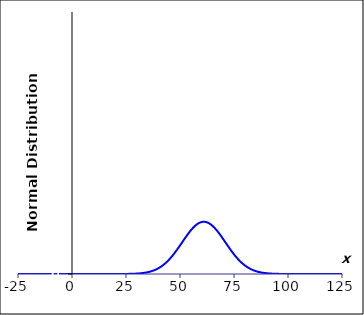
| Category | Series 0 |
|---|---|
| -25.0 | 0 |
| -24.0 | 0 |
| -23.0 | 0 |
| -22.0 | 0 |
| -21.0 | 0 |
| -20.0 | 0 |
| -19.0 | 0 |
| -18.0 | 0 |
| -17.0 | 0 |
| -16.0 | 0 |
| -15.0 | 0 |
| -14.0 | 0 |
| -13.0 | 0 |
| -12.0 | 0 |
| -11.0 | 0 |
| -10.0 | 0 |
| -9.0 | 0 |
| -8.0 | 0 |
| -7.0 | 0 |
| -6.0 | 0 |
| -5.0 | 0 |
| -4.0 | 0 |
| -3.0 | 0 |
| -2.0 | 0 |
| -1.0 | 0 |
| 0.0 | 0 |
| 1.0 | 0 |
| 2.0 | 0 |
| 3.0 | 0 |
| 4.0 | 0 |
| 5.0 | 0 |
| 6.0 | 0 |
| 7.0 | 0 |
| 8.0 | 0 |
| 9.0 | 0 |
| 10.0 | 0 |
| 11.0 | 0 |
| 12.0 | 0 |
| 13.0 | 0 |
| 14.0 | 0 |
| 15.0 | 0 |
| 16.0 | 0 |
| 17.0 | 0 |
| 18.0 | 0 |
| 19.0 | 0 |
| 20.0 | 0 |
| 21.0 | 0 |
| 22.0 | 0 |
| 23.0 | 0 |
| 24.0 | 0 |
| 25.0 | 0 |
| 26.0 | 0 |
| 27.0 | 0 |
| 28.0 | 0 |
| 29.0 | 0 |
| 30.0 | 0 |
| 31.0 | 0 |
| 32.0 | 0.001 |
| 33.0 | 0.001 |
| 34.0 | 0.001 |
| 35.0 | 0.001 |
| 36.0 | 0.002 |
| 37.0 | 0.002 |
| 38.0 | 0.003 |
| 39.0 | 0.004 |
| 40.0 | 0.004 |
| 41.0 | 0.005 |
| 42.0 | 0.007 |
| 43.0 | 0.008 |
| 44.0 | 0.009 |
| 45.0 | 0.011 |
| 46.0 | 0.013 |
| 47.0 | 0.015 |
| 48.0 | 0.017 |
| 49.0 | 0.019 |
| 50.0 | 0.022 |
| 51.0 | 0.024 |
| 52.0 | 0.027 |
| 53.0 | 0.029 |
| 54.0 | 0.031 |
| 55.0 | 0.033 |
| 56.0 | 0.035 |
| 57.0 | 0.037 |
| 58.0 | 0.038 |
| 59.0 | 0.039 |
| 60.0 | 0.04 |
| 61.0 | 0.04 |
| 62.0 | 0.04 |
| 63.0 | 0.039 |
| 64.0 | 0.038 |
| 65.0 | 0.037 |
| 66.0 | 0.035 |
| 67.0 | 0.033 |
| 68.0 | 0.031 |
| 69.0 | 0.029 |
| 70.0 | 0.027 |
| 71.0 | 0.024 |
| 72.0 | 0.022 |
| 73.0 | 0.019 |
| 74.0 | 0.017 |
| 75.0 | 0.015 |
| 76.0 | 0.013 |
| 77.0 | 0.011 |
| 78.0 | 0.009 |
| 79.0 | 0.008 |
| 80.0 | 0.007 |
| 81.0 | 0.005 |
| 82.0 | 0.004 |
| 83.0 | 0.004 |
| 84.0 | 0.003 |
| 85.0 | 0.002 |
| 86.0 | 0.002 |
| 87.0 | 0.001 |
| 88.0 | 0.001 |
| 89.0 | 0.001 |
| 90.0 | 0.001 |
| 91.0 | 0 |
| 92.0 | 0 |
| 93.0 | 0 |
| 94.0 | 0 |
| 95.0 | 0 |
| 96.0 | 0 |
| 97.0 | 0 |
| 98.0 | 0 |
| 99.0 | 0 |
| 100.0 | 0 |
| 101.0 | 0 |
| 102.0 | 0 |
| 103.0 | 0 |
| 104.0 | 0 |
| 105.0 | 0 |
| 106.0 | 0 |
| 107.0 | 0 |
| 108.0 | 0 |
| 109.0 | 0 |
| 110.0 | 0 |
| 111.0 | 0 |
| 112.0 | 0 |
| 113.0 | 0 |
| 114.0 | 0 |
| 115.0 | 0 |
| 116.0 | 0 |
| 117.0 | 0 |
| 118.0 | 0 |
| 119.0 | 0 |
| 120.0 | 0 |
| 121.0 | 0 |
| 122.0 | 0 |
| 123.0 | 0 |
| 124.0 | 0 |
| 125.0 | 0 |